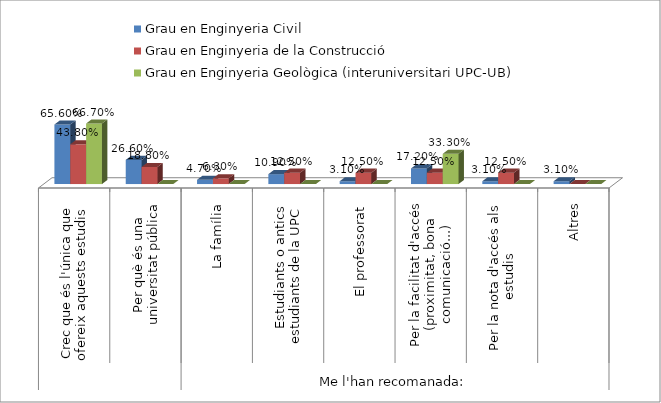
| Category | Grau en Enginyeria Civil | Grau en Enginyeria de la Construcció | Grau en Enginyeria Geològica (interuniversitari UPC-UB) |
|---|---|---|---|
| 0 | 0.656 | 0.438 | 0.667 |
| 1 | 0.266 | 0.188 | 0 |
| 2 | 0.047 | 0.063 | 0 |
| 3 | 0.109 | 0.125 | 0 |
| 4 | 0.031 | 0.125 | 0 |
| 5 | 0.172 | 0.125 | 0.333 |
| 6 | 0.031 | 0.125 | 0 |
| 7 | 0.031 | 0 | 0 |